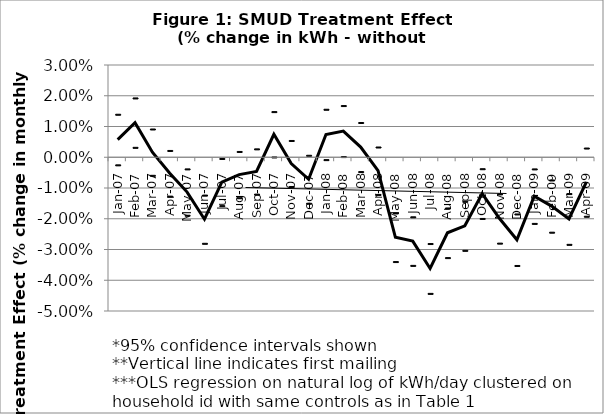
| Category | Treatment | 2 SD below | 2 SD above |
|---|---|---|---|
| 2007-01-01 | 0.006 | -0.002 | 0.014 |
| 2007-02-01 | 0.011 | 0.003 | 0.019 |
| 2007-03-01 | 0.002 | -0.006 | 0.009 |
| 2007-04-01 | -0.005 | -0.013 | 0.002 |
| 2007-05-01 | -0.011 | -0.019 | -0.004 |
| 2007-06-01 | -0.02 | -0.028 | -0.012 |
| 2007-07-01 | -0.008 | -0.016 | 0 |
| 2007-08-01 | -0.006 | -0.013 | 0.002 |
| 2007-09-01 | -0.005 | -0.012 | 0.003 |
| 2007-10-01 | 0.007 | 0 | 0.015 |
| 2007-11-01 | -0.002 | -0.01 | 0.005 |
| 2007-12-01 | -0.007 | -0.015 | 0.001 |
| 2008-01-01 | 0.007 | -0.001 | 0.016 |
| 2008-02-01 | 0.009 | 0 | 0.017 |
| 2008-03-01 | 0.003 | -0.005 | 0.011 |
| 2008-04-01 | -0.004 | -0.012 | 0.003 |
| 2008-05-01 | -0.026 | -0.034 | -0.018 |
| 2008-06-01 | -0.027 | -0.035 | -0.019 |
| 2008-07-01 | -0.036 | -0.044 | -0.028 |
| 2008-08-01 | -0.025 | -0.033 | -0.016 |
| 2008-09-01 | -0.022 | -0.03 | -0.014 |
| 2008-10-01 | -0.012 | -0.02 | -0.004 |
| 2008-11-01 | -0.02 | -0.028 | -0.012 |
| 2008-12-01 | -0.027 | -0.035 | -0.018 |
| 2009-01-01 | -0.013 | -0.022 | -0.004 |
| 2009-02-01 | -0.016 | -0.024 | -0.007 |
| 2009-03-01 | -0.02 | -0.028 | -0.012 |
| 2009-04-01 | -0.008 | -0.019 | 0.003 |